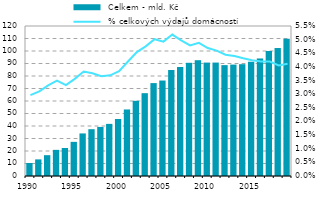
| Category |  Celkem - mld. Kč |
|---|---|
| 1990.0 | 10.403 |
| 1991.0 | 13.288 |
| 1992.0 | 16.657 |
| 1993.0 | 20.907 |
| 1994.0 | 22.4 |
| 1995.0 | 27.312 |
| 1996.0 | 34.057 |
| 1997.0 | 37.442 |
| 1998.0 | 39.238 |
| 1999.0 | 41.694 |
| 2000.0 | 45.597 |
| 2001.0 | 53.227 |
| 2002.0 | 60.134 |
| 2003.0 | 66.257 |
| 2004.0 | 74.326 |
| 2005.0 | 76.372 |
| 2006.0 | 84.814 |
| 2007.0 | 87.219 |
| 2008.0 | 90.562 |
| 2009.0 | 92.643 |
| 2010.0 | 90.738 |
| 2011.0 | 90.74 |
| 2012.0 | 88.698 |
| 2013.0 | 89.123 |
| 2014.0 | 89.45 |
| 2015.0 | 91.39 |
| 2016.0 | 94.027 |
| 2017.0 | 99.995 |
| 2018.0 | 102.372 |
| 2019.0 | 109.874 |